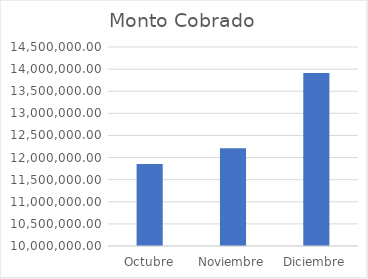
| Category | Monto Cobrado |
|---|---|
| Octubre | 11852287.5 |
| Noviembre | 12212815.75 |
| Diciembre | 13913332.95 |